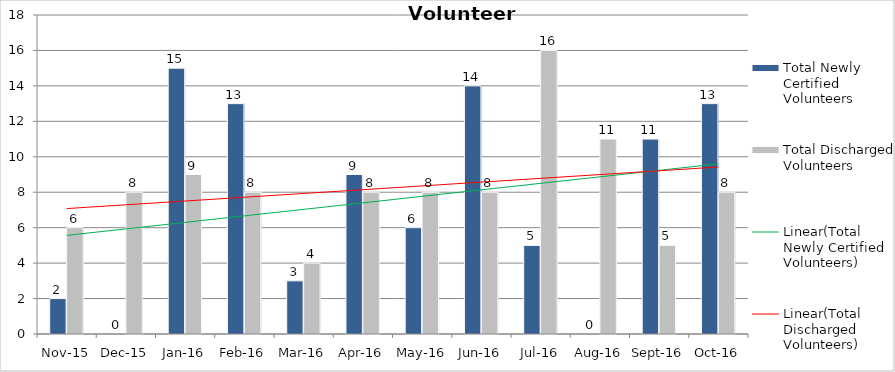
| Category | Total Newly Certified Volunteers | Total Discharged Volunteers |
|---|---|---|
| Nov-15 | 2 | 6 |
| Dec-15 | 0 | 8 |
| Jan-16 | 15 | 9 |
| Feb-16 | 13 | 8 |
| Mar-16 | 3 | 4 |
| Apr-16 | 9 | 8 |
| May-16 | 6 | 8 |
| Jun-16 | 14 | 8 |
| Jul-16 | 5 | 16 |
| Aug-16 | 0 | 11 |
| Sep-16 | 11 | 5 |
| Oct-16 | 13 | 8 |